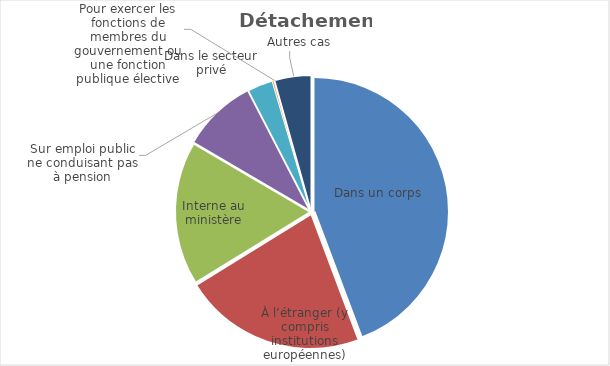
| Category | Détachement |
|---|---|
| Dans un corps | 44.298 |
| À l’étranger (y compris institutions européennes) | 21.922 |
| Interne au ministère | 17.248 |
| Sur emploi public ne conduisant pas à pension | 8.964 |
| Dans le secteur privé | 3.019 |
| Pour exercer les fonctions de membres du gouvernement ou une fonction publique élective | 0.219 |
| Autres cas | 4.355 |